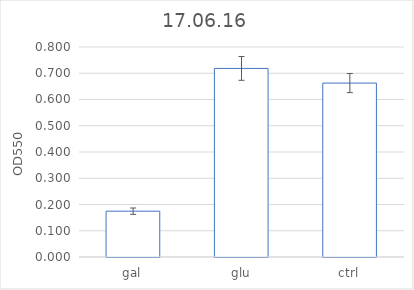
| Category | Series 0 |
|---|---|
| gal | 0.175 |
| glu | 0.718 |
| ctrl | 0.663 |